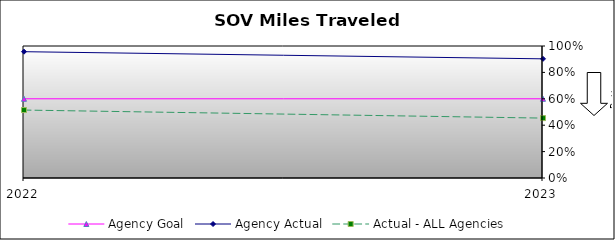
| Category | Agency Goal | Agency Actual | Actual - ALL Agencies |
|---|---|---|---|
| 2022.0 | 0.6 | 0.957 | 0.515 |
| 2023.0 | 0.6 | 0.903 | 0.454 |